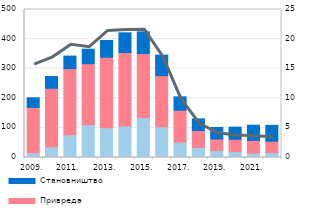
| Category | Остали сектори | Привреда | Становништво |
|---|---|---|---|
| 2009. | 16.3 | 153.043 | 32.3 |
| 2010. | 36.3 | 197.6 | 39.6 |
| 2011. | 77.1 | 223.3 | 42.2 |
| 2012. | 110.5 | 206.3 | 49 |
| 2013. | 100.2 | 238.4 | 56.7 |
| 2014. | 106.4 | 248.4 | 66.4 |
| 2015. | 134.4 | 216.8 | 73.4 |
| 2016. | 103.8 | 172.8 | 69.2 |
| 2017. | 51.9 | 107.6 | 45.4 |
| 2018. | 34.192 | 56.849 | 39.608 |
| 2019. | 23.45 | 38.949 | 39.017 |
| 2020. | 19.835 | 41.827 | 40.747 |
| 2021. | 14.723 | 43.14 | 51.148 |
| Март
2021. | 16.48 | 38.535 | 53.608 |